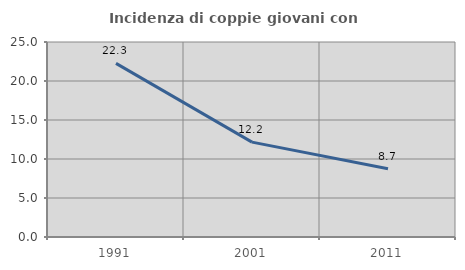
| Category | Incidenza di coppie giovani con figli |
|---|---|
| 1991.0 | 22.261 |
| 2001.0 | 12.166 |
| 2011.0 | 8.747 |